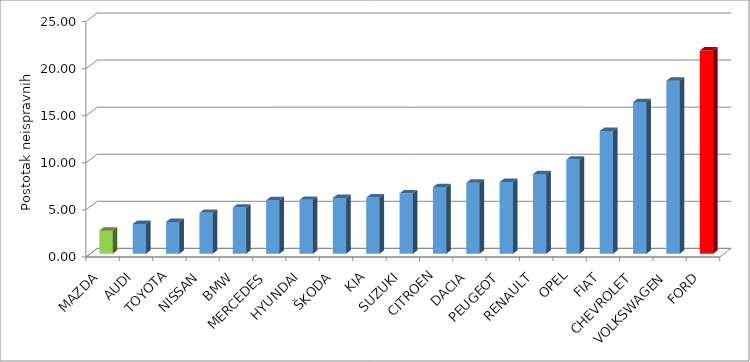
| Category | Series 4 |
|---|---|
| MAZDA | 2.451 |
| AUDI | 3.162 |
| TOYOTA | 3.379 |
| NISSAN | 4.34 |
| BMW | 4.901 |
| MERCEDES | 5.683 |
| HYUNDAI | 5.722 |
| ŠKODA | 5.932 |
| KIA | 5.965 |
| SUZUKI | 6.414 |
| CITROEN | 7.077 |
| DACIA | 7.545 |
| PEUGEOT | 7.615 |
| RENAULT | 8.458 |
| OPEL | 9.998 |
| FIAT | 13.032 |
| CHEVROLET | 16.103 |
| VOLKSWAGEN | 18.374 |
| FORD | 21.586 |